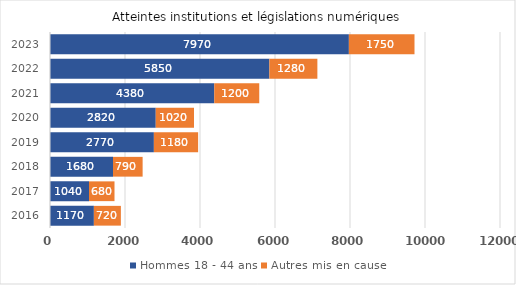
| Category | Hommes 18 - 44 ans | Autres mis en cause |
|---|---|---|
| 2016.0 | 1170 | 720 |
| 2017.0 | 1040 | 680 |
| 2018.0 | 1680 | 790 |
| 2019.0 | 2770 | 1180 |
| 2020.0 | 2820 | 1020 |
| 2021.0 | 4380 | 1200 |
| 2022.0 | 5850 | 1280 |
| 2023.0 | 7970 | 1750 |